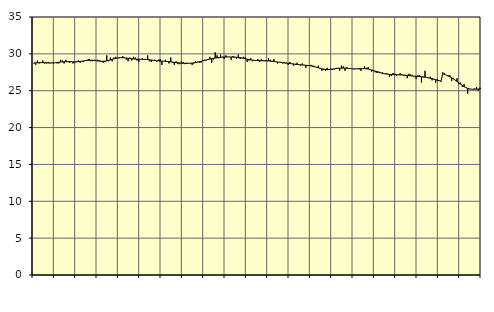
| Category | Piggar | Series 1 |
|---|---|---|
| nan | 28.7 | 28.77 |
| 1.0 | 28.5 | 28.78 |
| 1.0 | 29.1 | 28.8 |
| 1.0 | 28.7 | 28.8 |
| 1.0 | 28.8 | 28.81 |
| 1.0 | 29.1 | 28.81 |
| 1.0 | 28.7 | 28.8 |
| 1.0 | 28.7 | 28.79 |
| 1.0 | 28.9 | 28.78 |
| 1.0 | 28.7 | 28.77 |
| 1.0 | 28.8 | 28.77 |
| 1.0 | 28.7 | 28.78 |
| nan | 28.8 | 28.8 |
| 2.0 | 28.7 | 28.83 |
| 2.0 | 28.7 | 28.86 |
| 2.0 | 29.2 | 28.89 |
| 2.0 | 29.1 | 28.91 |
| 2.0 | 28.7 | 28.93 |
| 2.0 | 29.2 | 28.94 |
| 2.0 | 28.9 | 28.94 |
| 2.0 | 28.8 | 28.93 |
| 2.0 | 29 | 28.92 |
| 2.0 | 28.7 | 28.91 |
| 2.0 | 28.8 | 28.91 |
| nan | 29 | 28.92 |
| 3.0 | 29.1 | 28.95 |
| 3.0 | 28.8 | 28.97 |
| 3.0 | 29 | 29.01 |
| 3.0 | 28.9 | 29.04 |
| 3.0 | 29.1 | 29.08 |
| 3.0 | 29.2 | 29.11 |
| 3.0 | 29.3 | 29.13 |
| 3.0 | 29 | 29.14 |
| 3.0 | 29 | 29.13 |
| 3.0 | 29.2 | 29.11 |
| 3.0 | 29.1 | 29.07 |
| nan | 29.2 | 29.04 |
| 4.0 | 29.1 | 29.01 |
| 4.0 | 28.9 | 28.99 |
| 4.0 | 28.8 | 28.99 |
| 4.0 | 28.9 | 29.01 |
| 4.0 | 29.8 | 29.05 |
| 4.0 | 29 | 29.11 |
| 4.0 | 29.5 | 29.18 |
| 4.0 | 29 | 29.26 |
| 4.0 | 29.5 | 29.33 |
| 4.0 | 29.6 | 29.4 |
| 4.0 | 29.4 | 29.44 |
| nan | 29.4 | 29.47 |
| 5.0 | 29.5 | 29.48 |
| 5.0 | 29.7 | 29.48 |
| 5.0 | 29.5 | 29.46 |
| 5.0 | 29.2 | 29.44 |
| 5.0 | 29 | 29.4 |
| 5.0 | 29.5 | 29.37 |
| 5.0 | 29.1 | 29.33 |
| 5.0 | 29.6 | 29.31 |
| 5.0 | 29.5 | 29.29 |
| 5.0 | 29.1 | 29.28 |
| 5.0 | 28.9 | 29.27 |
| nan | 29.3 | 29.27 |
| 6.0 | 29.4 | 29.26 |
| 6.0 | 29.2 | 29.26 |
| 6.0 | 29.2 | 29.24 |
| 6.0 | 29.8 | 29.22 |
| 6.0 | 29 | 29.2 |
| 6.0 | 28.9 | 29.17 |
| 6.0 | 29.1 | 29.13 |
| 6.0 | 29.2 | 29.1 |
| 6.0 | 28.9 | 29.06 |
| 6.0 | 29.2 | 29.04 |
| 6.0 | 29.3 | 29.02 |
| nan | 28.5 | 29.01 |
| 7.0 | 29 | 29 |
| 7.0 | 29.2 | 28.99 |
| 7.0 | 28.9 | 28.97 |
| 7.0 | 28.7 | 28.94 |
| 7.0 | 29.5 | 28.91 |
| 7.0 | 28.8 | 28.88 |
| 7.0 | 28.5 | 28.85 |
| 7.0 | 29 | 28.82 |
| 7.0 | 28.6 | 28.79 |
| 7.0 | 28.6 | 28.76 |
| 7.0 | 29 | 28.74 |
| nan | 28.9 | 28.72 |
| 8.0 | 28.6 | 28.71 |
| 8.0 | 28.8 | 28.71 |
| 8.0 | 28.7 | 28.72 |
| 8.0 | 28.7 | 28.73 |
| 8.0 | 28.5 | 28.75 |
| 8.0 | 28.7 | 28.78 |
| 8.0 | 29 | 28.82 |
| 8.0 | 28.9 | 28.87 |
| 8.0 | 28.8 | 28.93 |
| 8.0 | 28.8 | 28.99 |
| 8.0 | 29.1 | 29.06 |
| nan | 29.2 | 29.12 |
| 9.0 | 29.1 | 29.18 |
| 9.0 | 29.2 | 29.24 |
| 9.0 | 29.6 | 29.29 |
| 9.0 | 28.8 | 29.34 |
| 9.0 | 29.2 | 29.39 |
| 9.0 | 30.2 | 29.43 |
| 9.0 | 29.8 | 29.47 |
| 9.0 | 29.4 | 29.51 |
| 9.0 | 29.9 | 29.53 |
| 9.0 | 29.6 | 29.55 |
| 9.0 | 29.3 | 29.57 |
| nan | 29.8 | 29.57 |
| 10.0 | 29.6 | 29.58 |
| 10.0 | 29.6 | 29.58 |
| 10.0 | 29.2 | 29.57 |
| 10.0 | 29.7 | 29.56 |
| 10.0 | 29.6 | 29.55 |
| 10.0 | 29.3 | 29.54 |
| 10.0 | 29.9 | 29.51 |
| 10.0 | 29.3 | 29.48 |
| 10.0 | 29.5 | 29.44 |
| 10.0 | 29.6 | 29.39 |
| 10.0 | 29.5 | 29.33 |
| nan | 28.9 | 29.28 |
| 11.0 | 29.1 | 29.22 |
| 11.0 | 29.4 | 29.18 |
| 11.0 | 29 | 29.15 |
| 11.0 | 29.1 | 29.12 |
| 11.0 | 29.1 | 29.1 |
| 11.0 | 29.3 | 29.1 |
| 11.0 | 28.9 | 29.09 |
| 11.0 | 29.3 | 29.09 |
| 11.0 | 29 | 29.08 |
| 11.0 | 29 | 29.07 |
| 11.0 | 29 | 29.06 |
| nan | 29.4 | 29.04 |
| 12.0 | 29.2 | 29.02 |
| 12.0 | 28.9 | 28.99 |
| 12.0 | 29.3 | 28.96 |
| 12.0 | 28.9 | 28.93 |
| 12.0 | 28.7 | 28.9 |
| 12.0 | 28.9 | 28.87 |
| 12.0 | 28.9 | 28.83 |
| 12.0 | 28.7 | 28.8 |
| 12.0 | 28.9 | 28.76 |
| 12.0 | 28.8 | 28.73 |
| 12.0 | 28.5 | 28.71 |
| nan | 28.9 | 28.68 |
| 13.0 | 28.7 | 28.66 |
| 13.0 | 28.4 | 28.63 |
| 13.0 | 28.5 | 28.6 |
| 13.0 | 28.8 | 28.57 |
| 13.0 | 28.5 | 28.54 |
| 13.0 | 28.4 | 28.51 |
| 13.0 | 28.7 | 28.49 |
| 13.0 | 28.5 | 28.47 |
| 13.0 | 28.1 | 28.45 |
| 13.0 | 28.4 | 28.43 |
| 13.0 | 28.4 | 28.4 |
| nan | 28.5 | 28.36 |
| 14.0 | 28.4 | 28.31 |
| 14.0 | 28.2 | 28.25 |
| 14.0 | 28.2 | 28.18 |
| 14.0 | 28.4 | 28.11 |
| 14.0 | 28 | 28.04 |
| 14.0 | 27.7 | 27.98 |
| 14.0 | 27.8 | 27.93 |
| 14.0 | 27.7 | 27.89 |
| 14.0 | 28.1 | 27.87 |
| 14.0 | 27.9 | 27.88 |
| 14.0 | 28 | 27.9 |
| nan | 27.8 | 27.93 |
| 15.0 | 27.9 | 27.96 |
| 15.0 | 28.1 | 28 |
| 15.0 | 28.1 | 28.03 |
| 15.0 | 27.7 | 28.05 |
| 15.0 | 28.4 | 28.06 |
| 15.0 | 28.3 | 28.06 |
| 15.0 | 27.7 | 28.06 |
| 15.0 | 28.2 | 28.05 |
| 15.0 | 28 | 28.02 |
| 15.0 | 28 | 28 |
| 15.0 | 28 | 27.97 |
| nan | 27.9 | 27.96 |
| 16.0 | 28 | 27.96 |
| 16.0 | 28 | 27.97 |
| 16.0 | 27.9 | 27.98 |
| 16.0 | 27.7 | 27.99 |
| 16.0 | 28 | 28 |
| 16.0 | 28.3 | 28 |
| 16.0 | 28.1 | 27.97 |
| 16.0 | 28.2 | 27.94 |
| 16.0 | 27.8 | 27.88 |
| 16.0 | 27.6 | 27.82 |
| 16.0 | 27.8 | 27.74 |
| nan | 27.5 | 27.66 |
| 17.0 | 27.4 | 27.58 |
| 17.0 | 27.6 | 27.5 |
| 17.0 | 27.4 | 27.43 |
| 17.0 | 27.5 | 27.37 |
| 17.0 | 27.3 | 27.31 |
| 17.0 | 27.4 | 27.27 |
| 17.0 | 27.3 | 27.24 |
| 17.0 | 26.9 | 27.22 |
| 17.0 | 27 | 27.2 |
| 17.0 | 27.4 | 27.18 |
| 17.0 | 27.3 | 27.17 |
| nan | 27 | 27.16 |
| 18.0 | 27.2 | 27.16 |
| 18.0 | 27.4 | 27.15 |
| 18.0 | 27.2 | 27.14 |
| 18.0 | 27 | 27.13 |
| 18.0 | 27 | 27.11 |
| 18.0 | 26.7 | 27.08 |
| 18.0 | 27.3 | 27.05 |
| 18.0 | 27.2 | 27.02 |
| 18.0 | 27.1 | 26.99 |
| 18.0 | 27 | 26.97 |
| 18.0 | 26.6 | 26.95 |
| nan | 27.1 | 26.94 |
| 19.0 | 27.1 | 26.92 |
| 19.0 | 26.1 | 26.9 |
| 19.0 | 26.8 | 26.88 |
| 19.0 | 27.7 | 26.84 |
| 19.0 | 26.8 | 26.8 |
| 19.0 | 26.7 | 26.75 |
| 19.0 | 26.9 | 26.69 |
| 19.0 | 26.4 | 26.63 |
| 19.0 | 26.6 | 26.56 |
| 19.0 | 26.1 | 26.49 |
| 19.0 | 26.6 | 26.42 |
| nan | 26.4 | 26.36 |
| 20.0 | 26.2 | 26.29 |
| 20.0 | 27.5 | 27.32 |
| 20.0 | 27.4 | 27.2 |
| 20.0 | 27.1 | 27.11 |
| 20.0 | 27.1 | 27 |
| 20.0 | 27.1 | 26.88 |
| 20.0 | 26.3 | 26.75 |
| 20.0 | 26.7 | 26.6 |
| 20.0 | 26.4 | 26.44 |
| 20.0 | 26.7 | 26.26 |
| 20.0 | 25.9 | 26.07 |
| nan | 26.1 | 25.89 |
| 21.0 | 25.5 | 25.71 |
| 21.0 | 25.9 | 25.55 |
| 21.0 | 25.4 | 25.42 |
| 21.0 | 24.6 | 25.31 |
| 21.0 | 25.2 | 25.25 |
| 21.0 | 25.2 | 25.21 |
| 21.0 | 25.2 | 25.2 |
| 21.0 | 25.3 | 25.2 |
| 21.0 | 25.5 | 25.22 |
| 21.0 | 25 | 25.23 |
| 21.0 | 25.4 | 25.23 |